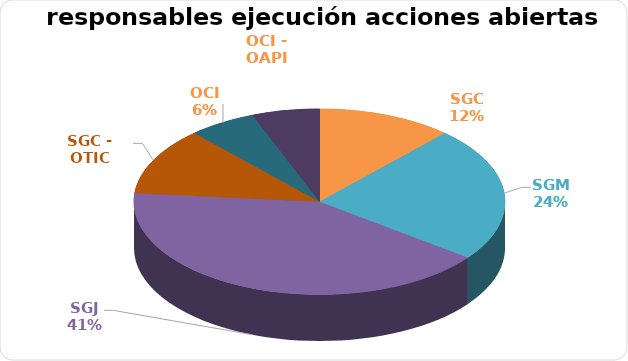
| Category | Series 0 |
|---|---|
| SGC | 2 |
| SGM | 4 |
| SGJ | 7 |
| SGC - OTIC | 2 |
| OCI | 1 |
| OCI - OAPI | 1 |